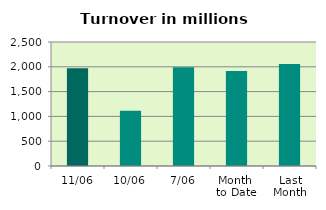
| Category | Series 0 |
|---|---|
| 11/06 | 1969.616 |
| 10/06 | 1115.368 |
| 7/06 | 1991.376 |
| Month 
to Date | 1914.708 |
| Last
Month | 2056.808 |